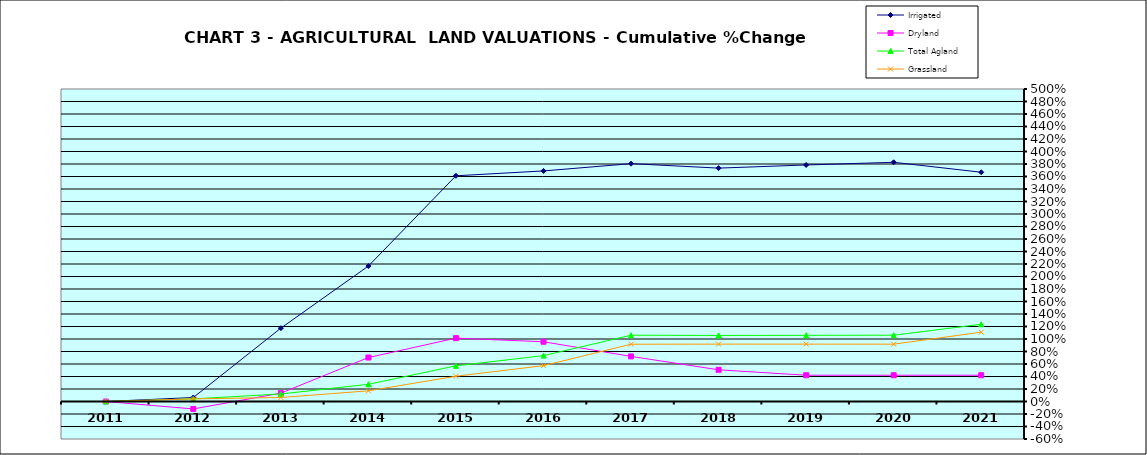
| Category | Irrigated | Dryland | Total Agland | Grassland |
|---|---|---|---|---|
| 2011.0 | 0 | 0 | 0 | 0 |
| 2012.0 | 0.064 | -0.119 | 0.042 | 0.042 |
| 2013.0 | 1.174 | 0.134 | 0.12 | 0.064 |
| 2014.0 | 2.167 | 0.703 | 0.276 | 0.171 |
| 2015.0 | 3.612 | 1.014 | 0.571 | 0.404 |
| 2016.0 | 3.689 | 0.956 | 0.734 | 0.574 |
| 2017.0 | 3.806 | 0.722 | 1.061 | 0.916 |
| 2018.0 | 3.734 | 0.507 | 1.057 | 0.918 |
| 2019.0 | 3.784 | 0.42 | 1.059 | 0.918 |
| 2020.0 | 3.827 | 0.42 | 1.061 | 0.917 |
| 2021.0 | 3.668 | 0.42 | 1.236 | 1.109 |